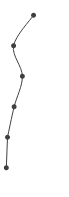
| Category | Series 0 |
|---|---|
| 0.4503521557614459 | 1 |
| 0.12306367699507931 | 2 |
| 0.26736308123436636 | 3 |
| 0.1321430279742958 | 4 |
| 0.0233599255931262 | 5 |
| 0.0036596931244429433 | 6 |